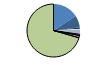
| Category | Series 0 |
|---|---|
| ARRASTRE | 110 |
| CERCO | 51 |
| ATUNEROS CAÑEROS | 6 |
| PALANGRE DE FONDO | 4 |
| PALANGRE DE SUPERFICIE | 16 |
| RASCO | 3 |
| VOLANTA | 5 |
| ARTES FIJAS | 10 |
| ARTES MENORES | 491 |